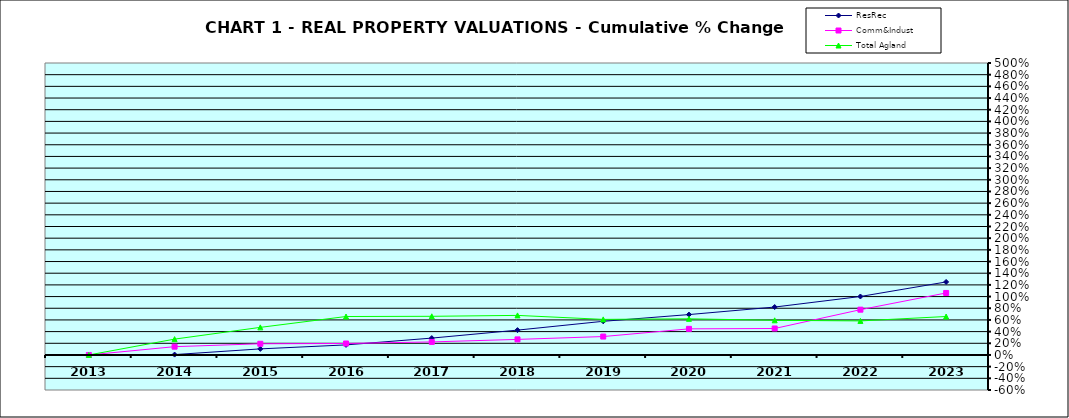
| Category | ResRec | Comm&Indust | Total Agland |
|---|---|---|---|
| 2013.0 | 0 | 0 | 0 |
| 2014.0 | 0.007 | 0.142 | 0.271 |
| 2015.0 | 0.104 | 0.192 | 0.473 |
| 2016.0 | 0.172 | 0.196 | 0.659 |
| 2017.0 | 0.289 | 0.224 | 0.662 |
| 2018.0 | 0.426 | 0.267 | 0.678 |
| 2019.0 | 0.576 | 0.315 | 0.609 |
| 2020.0 | 0.692 | 0.447 | 0.619 |
| 2021.0 | 0.821 | 0.453 | 0.593 |
| 2022.0 | 1.001 | 0.776 | 0.583 |
| 2023.0 | 1.251 | 1.062 | 0.658 |